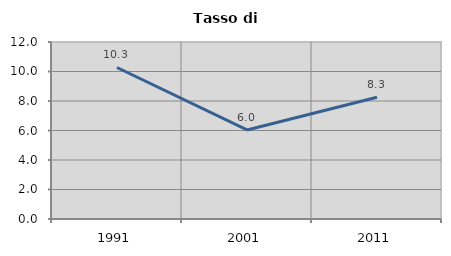
| Category | Tasso di disoccupazione   |
|---|---|
| 1991.0 | 10.271 |
| 2001.0 | 6.036 |
| 2011.0 | 8.258 |